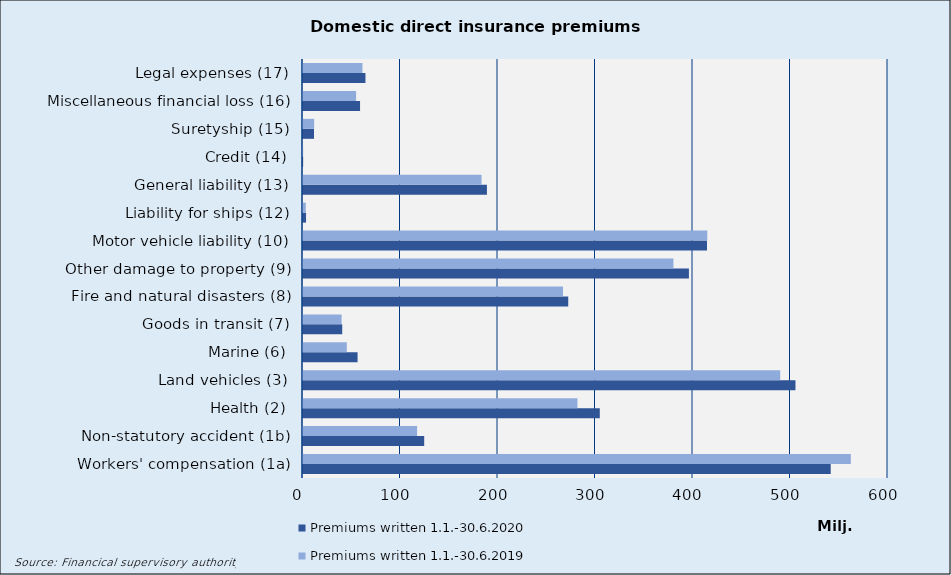
| Category | Premiums written |
|---|---|
| Workers' compensation (1a) | 561887.665 |
| Non-statutory accident (1b) | 117005.951 |
| Health (2) | 281474.77 |
| Land vehicles (3) | 489448.476 |
| Marine (6) | 44918.393 |
| Goods in transit (7) | 39588.342 |
| Fire and natural disasters (8) | 266677.398 |
| Other damage to property (9) | 379935.163 |
| Motor vehicle liability (10) | 414639.953 |
| Liability for ships (12) | 2869.835 |
| General liability (13) | 183119.689 |
| Credit (14) | 143.306 |
| Suretyship (15) | 11445.042 |
| Miscellaneous financial loss (16) | 54456.64 |
| Legal expenses (17) | 60974.074 |